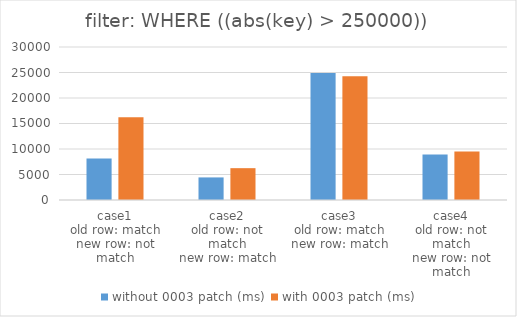
| Category | without 0003 patch (ms) | with 0003 patch (ms) |
|---|---|---|
| case1
old row: match
new row: not match | 8161.282 | 16245.893 |
| case2
old row: not match
new row: match | 4427.713 | 6241.958 |
| case3
old row: match
new row: match | 24919.129 | 24243.359 |
| case4
old row: not match
new row: not match | 8905.076 | 9502.12 |